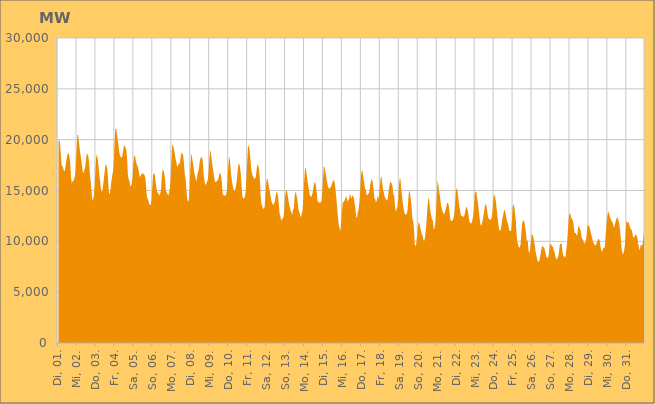
| Category | Series 0 |
|---|---|
|  Di, 01.  | 19693.642 |
|  Di, 01.  | 20068.897 |
|  Di, 01.  | 19688.691 |
|  Di, 01.  | 18616.505 |
|  Di, 01.  | 17537.358 |
|  Di, 01.  | 17402.935 |
|  Di, 01.  | 17214.777 |
|  Di, 01.  | 16918.035 |
|  Di, 01.  | 16916.652 |
|  Di, 01.  | 17365.938 |
|  Di, 01.  | 17901.29 |
|  Di, 01.  | 18314.461 |
|  Di, 01.  | 18692.964 |
|  Di, 01.  | 18643.132 |
|  Di, 01.  | 18341.745 |
|  Di, 01.  | 17614.667 |
|  Di, 01.  | 16274.69 |
|  Mi, 02.  | 15692.052 |
|  Mi, 02.  | 15936.958 |
|  Mi, 02.  | 15939.742 |
|  Mi, 02.  | 16109.594 |
|  Mi, 02.  | 16467.934 |
|  Mi, 02.  | 17242.414 |
|  Mi, 02.  | 19081.249 |
|  Mi, 02.  | 20461.468 |
|  Mi, 02.  | 20462.138 |
|  Mi, 02.  | 19762.932 |
|  Mi, 02.  | 19057.894 |
|  Mi, 02.  | 18480.672 |
|  Mi, 02.  | 17950.802 |
|  Mi, 02.  | 17387.023 |
|  Mi, 02.  | 16773.458 |
|  Mi, 02.  | 16740.052 |
|  Mi, 02.  | 17064.838 |
|  Mi, 02.  | 17352.052 |
|  Mi, 02.  | 18049.322 |
|  Mi, 02.  | 18628.759 |
|  Mi, 02.  | 18552.995 |
|  Mi, 02.  | 18334.909 |
|  Mi, 02.  | 17581.178 |
|  Mi, 02.  | 16430.205 |
|  Do, 03.  | 15855.174 |
|  Do, 03.  | 14891.868 |
|  Do, 03.  | 14044.178 |
|  Do, 03.  | 14127.762 |
|  Do, 03.  | 14552.361 |
|  Do, 03.  | 15573.614 |
|  Do, 03.  | 17344.207 |
|  Do, 03.  | 18490.431 |
|  Do, 03.  | 18384.52 |
|  Do, 03.  | 17949.707 |
|  Do, 03.  | 17244.817 |
|  Do, 03.  | 16397.238 |
|  Do, 03.  | 15811.812 |
|  Do, 03.  | 15038.098 |
|  Do, 03.  | 14839.016 |
|  Do, 03.  | 15147.596 |
|  Do, 03.  | 15774.472 |
|  Do, 03.  | 16466.453 |
|  Do, 03.  | 17140.58 |
|  Do, 03.  | 17571.423 |
|  Do, 03.  | 17480.672 |
|  Do, 03.  | 17066.1 |
|  Do, 03.  | 15951.009 |
|  Do, 03.  | 14719.392 |
|  Fr, 04.  | 14665.744 |
|  Fr, 04.  | 15145.658 |
|  Fr, 04.  | 15874.726 |
|  Fr, 04.  | 16383.368 |
|  Fr, 04.  | 16849.576 |
|  Fr, 04.  | 17575.166 |
|  Fr, 04.  | 19509.325 |
|  Fr, 04.  | 21045.221 |
|  Fr, 04.  | 21097.062 |
|  Fr, 04.  | 20607.852 |
|  Fr, 04.  | 20081.193 |
|  Fr, 04.  | 19480.207 |
|  Fr, 04.  | 18805.662 |
|  Fr, 04.  | 18411.908 |
|  Fr, 04.  | 18292.72 |
|  Fr, 04.  | 18207.278 |
|  Fr, 04.  | 18426.27 |
|  Fr, 04.  | 18925.554 |
|  Fr, 04.  | 19425.358 |
|  Fr, 04.  | 19377.806 |
|  Fr, 04.  | 19150.7 |
|  Fr, 04.  | 19034.544 |
|  Fr, 04.  | 18045.578 |
|  Fr, 04.  | 16480.56 |
|  Sa, 05.  | 16107.502 |
|  Sa, 05.  | 15874.636 |
|  Sa, 05.  | 15432.455 |
|  Sa, 05.  | 15449.189 |
|  Sa, 05.  | 15730.779 |
|  Sa, 05.  | 16362.493 |
|  Sa, 05.  | 17734.382 |
|  Sa, 05.  | 18499.935 |
|  Sa, 05.  | 18363.549 |
|  Sa, 05.  | 17937.359 |
|  Sa, 05.  | 17594.421 |
|  Sa, 05.  | 17469.32 |
|  Sa, 05.  | 17171.495 |
|  Sa, 05.  | 16739.804 |
|  Sa, 05.  | 16323.036 |
|  Sa, 05.  | 16424.166 |
|  Sa, 05.  | 16590.156 |
|  Sa, 05.  | 16717.886 |
|  Sa, 05.  | 16570.696 |
|  Sa, 05.  | 16689.81 |
|  Sa, 05.  | 16519.621 |
|  Sa, 05.  | 16222.665 |
|  Sa, 05.  | 15489.944 |
|  Sa, 05.  | 14380.56 |
|  So, 06.  | 14174.498 |
|  So, 06.  | 13963.707 |
|  So, 06.  | 13685.215 |
|  So, 06.  | 13602.306 |
|  So, 06.  | 13578.073 |
|  So, 06.  | 14164.936 |
|  So, 06.  | 15494.169 |
|  So, 06.  | 16555.933 |
|  So, 06.  | 16734.002 |
|  So, 06.  | 16622.776 |
|  So, 06.  | 15908.81 |
|  So, 06.  | 15309.197 |
|  So, 06.  | 14864.817 |
|  So, 06.  | 14751.718 |
|  So, 06.  | 14652.493 |
|  So, 06.  | 14509.425 |
|  So, 06.  | 14740.953 |
|  So, 06.  | 15137.05 |
|  So, 06.  | 16447.303 |
|  So, 06.  | 17139.758 |
|  So, 06.  | 16938.596 |
|  So, 06.  | 16689.829 |
|  So, 06.  | 16071.81 |
|  So, 06.  | 14958.146 |
|  Mo, 07.  | 14843.218 |
|  Mo, 07.  | 14677.03 |
|  Mo, 07.  | 14498.136 |
|  Mo, 07.  | 14744.186 |
|  Mo, 07.  | 15177.472 |
|  Mo, 07.  | 16001.507 |
|  Mo, 07.  | 17843.126 |
|  Mo, 07.  | 19536.629 |
|  Mo, 07.  | 19415.579 |
|  Mo, 07.  | 19113.39 |
|  Mo, 07.  | 18734.884 |
|  Mo, 07.  | 18241.646 |
|  Mo, 07.  | 17875.373 |
|  Mo, 07.  | 17510.144 |
|  Mo, 07.  | 17288.171 |
|  Mo, 07.  | 17658.031 |
|  Mo, 07.  | 17577.209 |
|  Mo, 07.  | 17811.568 |
|  Mo, 07.  | 18399.456 |
|  Mo, 07.  | 18749.404 |
|  Mo, 07.  | 18634.524 |
|  Mo, 07.  | 18430.051 |
|  Mo, 07.  | 17612.606 |
|  Mo, 07.  | 16554.201 |
|  Di, 08.  | 16167.428 |
|  Di, 08.  | 15096.06 |
|  Di, 08.  | 14233.565 |
|  Di, 08.  | 13948.062 |
|  Di, 08.  | 13933.579 |
|  Di, 08.  | 14978.086 |
|  Di, 08.  | 17112.792 |
|  Di, 08.  | 18555.711 |
|  Di, 08.  | 18394.727 |
|  Di, 08.  | 17800.674 |
|  Di, 08.  | 17340.145 |
|  Di, 08.  | 16731.418 |
|  Di, 08.  | 16432.752 |
|  Di, 08.  | 16118.751 |
|  Di, 08.  | 15938.183 |
|  Di, 08.  | 16610.821 |
|  Di, 08.  | 16847.005 |
|  Di, 08.  | 17246.686 |
|  Di, 08.  | 17898.538 |
|  Di, 08.  | 18214.894 |
|  Di, 08.  | 18249.159 |
|  Di, 08.  | 18258.116 |
|  Di, 08.  | 17632.417 |
|  Di, 08.  | 16456.925 |
|  Mi, 09.  | 15890.884 |
|  Mi, 09.  | 15538.059 |
|  Mi, 09.  | 15604.455 |
|  Mi, 09.  | 15848.106 |
|  Mi, 09.  | 16033.885 |
|  Mi, 09.  | 16723.831 |
|  Mi, 09.  | 17931.044 |
|  Mi, 09.  | 18966.731 |
|  Mi, 09.  | 18722.198 |
|  Mi, 09.  | 18071.224 |
|  Mi, 09.  | 17452.52 |
|  Mi, 09.  | 16954.838 |
|  Mi, 09.  | 16366.605 |
|  Mi, 09.  | 15937.718 |
|  Mi, 09.  | 15826.616 |
|  Mi, 09.  | 15862.853 |
|  Mi, 09.  | 15986.187 |
|  Mi, 09.  | 16029.794 |
|  Mi, 09.  | 16336.956 |
|  Mi, 09.  | 16695.312 |
|  Mi, 09.  | 16699.865 |
|  Mi, 09.  | 16408.897 |
|  Mi, 09.  | 15714.563 |
|  Mi, 09.  | 14617.999 |
|  Do, 10.  | 14551.582 |
|  Do, 10.  | 14473.575 |
|  Do, 10.  | 14528.21 |
|  Do, 10.  | 14512.459 |
|  Do, 10.  | 14873.211 |
|  Do, 10.  | 15948.056 |
|  Do, 10.  | 17349.116 |
|  Do, 10.  | 18426.539 |
|  Do, 10.  | 17995.885 |
|  Do, 10.  | 17139.297 |
|  Do, 10.  | 16301.995 |
|  Do, 10.  | 15725.068 |
|  Do, 10.  | 15324.376 |
|  Do, 10.  | 15037.393 |
|  Do, 10.  | 14925.538 |
|  Do, 10.  | 15157.491 |
|  Do, 10.  | 15551.175 |
|  Do, 10.  | 16120.004 |
|  Do, 10.  | 17070.609 |
|  Do, 10.  | 17630.181 |
|  Do, 10.  | 17585.21 |
|  Do, 10.  | 17235.866 |
|  Do, 10.  | 16504.407 |
|  Do, 10.  | 15216.935 |
|  Fr, 11.  | 14401.631 |
|  Fr, 11.  | 14218.524 |
|  Fr, 11.  | 14236.934 |
|  Fr, 11.  | 14351.26 |
|  Fr, 11.  | 14853.424 |
|  Fr, 11.  | 16172.934 |
|  Fr, 11.  | 17835.706 |
|  Fr, 11.  | 19386.711 |
|  Fr, 11.  | 19357.71 |
|  Fr, 11.  | 19027.297 |
|  Fr, 11.  | 18095.358 |
|  Fr, 11.  | 17132.397 |
|  Fr, 11.  | 16697.203 |
|  Fr, 11.  | 16438.041 |
|  Fr, 11.  | 16302.572 |
|  Fr, 11.  | 16131.998 |
|  Fr, 11.  | 16205.603 |
|  Fr, 11.  | 16350.64 |
|  Fr, 11.  | 17095.817 |
|  Fr, 11.  | 17600.057 |
|  Fr, 11.  | 17423.741 |
|  Fr, 11.  | 17096.615 |
|  Fr, 11.  | 16082.373 |
|  Fr, 11.  | 14476.13 |
|  Sa, 12.  | 13613.989 |
|  Sa, 12.  | 13531.665 |
|  Sa, 12.  | 13123.821 |
|  Sa, 12.  | 13297.325 |
|  Sa, 12.  | 13337.603 |
|  Sa, 12.  | 14350.381 |
|  Sa, 12.  | 15611.52 |
|  Sa, 12.  | 16152.32 |
|  Sa, 12.  | 16128.659 |
|  Sa, 12.  | 15549.527 |
|  Sa, 12.  | 15142.291 |
|  Sa, 12.  | 14688.334 |
|  Sa, 12.  | 14254.994 |
|  Sa, 12.  | 13863.821 |
|  Sa, 12.  | 13634.153 |
|  Sa, 12.  | 13619.812 |
|  Sa, 12.  | 13698.325 |
|  Sa, 12.  | 13953.349 |
|  Sa, 12.  | 14422.447 |
|  Sa, 12.  | 14852.406 |
|  Sa, 12.  | 14803.261 |
|  Sa, 12.  | 14435.492 |
|  Sa, 12.  | 13681.515 |
|  Sa, 12.  | 12708.65 |
|  So, 13.  | 12475.534 |
|  So, 13.  | 11972.435 |
|  So, 13.  | 12274.796 |
|  So, 13.  | 12181.289 |
|  So, 13.  | 12408.808 |
|  So, 13.  | 13162.425 |
|  So, 13.  | 14439.965 |
|  So, 13.  | 14928.736 |
|  So, 13.  | 15072.53 |
|  So, 13.  | 14665.829 |
|  So, 13.  | 14167.014 |
|  So, 13.  | 13649.558 |
|  So, 13.  | 13354.012 |
|  So, 13.  | 13009.182 |
|  So, 13.  | 12882.278 |
|  So, 13.  | 12530.605 |
|  So, 13.  | 13164.16 |
|  So, 13.  | 13176.024 |
|  So, 13.  | 14365.354 |
|  So, 13.  | 14907.756 |
|  So, 13.  | 14701.555 |
|  So, 13.  | 14302.239 |
|  So, 13.  | 13745.249 |
|  So, 13.  | 13058.803 |
|  Mo, 14.  | 12884.322 |
|  Mo, 14.  | 12583.888 |
|  Mo, 14.  | 12356.828 |
|  Mo, 14.  | 12676.067 |
|  Mo, 14.  | 13042.885 |
|  Mo, 14.  | 14070.265 |
|  Mo, 14.  | 15788.222 |
|  Mo, 14.  | 16997.733 |
|  Mo, 14.  | 17321.184 |
|  Mo, 14.  | 16703.037 |
|  Mo, 14.  | 16116.706 |
|  Mo, 14.  | 15511.979 |
|  Mo, 14.  | 15142.293 |
|  Mo, 14.  | 14631.879 |
|  Mo, 14.  | 14420.275 |
|  Mo, 14.  | 14366.652 |
|  Mo, 14.  | 14543.022 |
|  Mo, 14.  | 14855.428 |
|  Mo, 14.  | 15436.196 |
|  Mo, 14.  | 15810.234 |
|  Mo, 14.  | 15774.187 |
|  Mo, 14.  | 15453.711 |
|  Mo, 14.  | 14844.051 |
|  Mo, 14.  | 13947.215 |
|  Di, 15.  | 13870.828 |
|  Di, 15.  | 13850.669 |
|  Di, 15.  | 13760.594 |
|  Di, 15.  | 13846.486 |
|  Di, 15.  | 13957.984 |
|  Di, 15.  | 14977.208 |
|  Di, 15.  | 16239.246 |
|  Di, 15.  | 17345.582 |
|  Di, 15.  | 17292.376 |
|  Di, 15.  | 16815.653 |
|  Di, 15.  | 16361.659 |
|  Di, 15.  | 15859.495 |
|  Di, 15.  | 15470.42 |
|  Di, 15.  | 15255.098 |
|  Di, 15.  | 15160.376 |
|  Di, 15.  | 15287.477 |
|  Di, 15.  | 15335.172 |
|  Di, 15.  | 15571.278 |
|  Di, 15.  | 15831.527 |
|  Di, 15.  | 16004.602 |
|  Di, 15.  | 15971.314 |
|  Di, 15.  | 15607.685 |
|  Di, 15.  | 14921.26 |
|  Di, 15.  | 14075.209 |
|  Mi, 16.  | 13227.365 |
|  Mi, 16.  | 12281.258 |
|  Mi, 16.  | 11556.515 |
|  Mi, 16.  | 11279.527 |
|  Mi, 16.  | 11012.737 |
|  Mi, 16.  | 11896.013 |
|  Mi, 16.  | 13117.529 |
|  Mi, 16.  | 13835.236 |
|  Mi, 16.  | 13864.945 |
|  Mi, 16.  | 13978.18 |
|  Mi, 16.  | 14165.731 |
|  Mi, 16.  | 14463.844 |
|  Mi, 16.  | 14295.494 |
|  Mi, 16.  | 13887.259 |
|  Mi, 16.  | 14087.165 |
|  Mi, 16.  | 14154.596 |
|  Mi, 16.  | 14651.084 |
|  Mi, 16.  | 14497.529 |
|  Mi, 16.  | 14193.971 |
|  Mi, 16.  | 14513.953 |
|  Mi, 16.  | 14458.729 |
|  Mi, 16.  | 14222.898 |
|  Mi, 16.  | 13684.48 |
|  Mi, 16.  | 13240.919 |
|  Do, 17.  | 12351.467 |
|  Do, 17.  | 12359.338 |
|  Do, 17.  | 12821.416 |
|  Do, 17.  | 13196.273 |
|  Do, 17.  | 13797.756 |
|  Do, 17.  | 14885.098 |
|  Do, 17.  | 16405.323 |
|  Do, 17.  | 16978.972 |
|  Do, 17.  | 16941.269 |
|  Do, 17.  | 16265.911 |
|  Do, 17.  | 15825.856 |
|  Do, 17.  | 15261.086 |
|  Do, 17.  | 15058.958 |
|  Do, 17.  | 14580.67 |
|  Do, 17.  | 14510.793 |
|  Do, 17.  | 14660.915 |
|  Do, 17.  | 14729.494 |
|  Do, 17.  | 15076.052 |
|  Do, 17.  | 15643.659 |
|  Do, 17.  | 16073.573 |
|  Do, 17.  | 16090.473 |
|  Do, 17.  | 15758.109 |
|  Do, 17.  | 14983.02 |
|  Do, 17.  | 14238.48 |
|  Fr, 18.  | 14139.535 |
|  Fr, 18.  | 13794.059 |
|  Fr, 18.  | 14028.002 |
|  Fr, 18.  | 14526.89 |
|  Fr, 18.  | 14137.639 |
|  Fr, 18.  | 14543.03 |
|  Fr, 18.  | 15482.342 |
|  Fr, 18.  | 16271.977 |
|  Fr, 18.  | 16436.735 |
|  Fr, 18.  | 15601.624 |
|  Fr, 18.  | 15080.844 |
|  Fr, 18.  | 14749.528 |
|  Fr, 18.  | 14391.763 |
|  Fr, 18.  | 14257.592 |
|  Fr, 18.  | 14077.536 |
|  Fr, 18.  | 13981.361 |
|  Fr, 18.  | 14284.762 |
|  Fr, 18.  | 14946.938 |
|  Fr, 18.  | 15492.944 |
|  Fr, 18.  | 15874.767 |
|  Fr, 18.  | 15805.748 |
|  Fr, 18.  | 15646.076 |
|  Fr, 18.  | 15369.621 |
|  Fr, 18.  | 14616.03 |
|  Sa, 19.  | 14471.56 |
|  Sa, 19.  | 13530.029 |
|  Sa, 19.  | 12874.006 |
|  Sa, 19.  | 13158.321 |
|  Sa, 19.  | 13343.709 |
|  Sa, 19.  | 14112.805 |
|  Sa, 19.  | 15439.131 |
|  Sa, 19.  | 16201.545 |
|  Sa, 19.  | 16126.529 |
|  Sa, 19.  | 15123.885 |
|  Sa, 19.  | 14420.338 |
|  Sa, 19.  | 13757.993 |
|  Sa, 19.  | 13183.072 |
|  Sa, 19.  | 12806.464 |
|  Sa, 19.  | 12659.415 |
|  Sa, 19.  | 12617.703 |
|  Sa, 19.  | 12695.474 |
|  Sa, 19.  | 13081.017 |
|  Sa, 19.  | 14258.676 |
|  Sa, 19.  | 15035.547 |
|  Sa, 19.  | 14735.011 |
|  Sa, 19.  | 14208.449 |
|  Sa, 19.  | 13403.896 |
|  Sa, 19.  | 12259.784 |
|  So, 20.  | 11997.542 |
|  So, 20.  | 11272.293 |
|  So, 20.  | 9801.638 |
|  So, 20.  | 9460.418 |
|  So, 20.  | 9744.384 |
|  So, 20.  | 10506.245 |
|  So, 20.  | 11441.558 |
|  So, 20.  | 11914.345 |
|  So, 20.  | 11715.632 |
|  So, 20.  | 11362.787 |
|  So, 20.  | 11010.028 |
|  So, 20.  | 10689.29 |
|  So, 20.  | 10549.998 |
|  So, 20.  | 10163.65 |
|  So, 20.  | 10014.743 |
|  So, 20.  | 10343.157 |
|  So, 20.  | 11101.999 |
|  So, 20.  | 11927.807 |
|  So, 20.  | 13205.933 |
|  So, 20.  | 14073.894 |
|  So, 20.  | 14332.341 |
|  So, 20.  | 13498.422 |
|  So, 20.  | 12884.708 |
|  So, 20.  | 12483.484 |
|  Mo, 21.  | 12109.736 |
|  Mo, 21.  | 12048.794 |
|  Mo, 21.  | 11195.347 |
|  Mo, 21.  | 11285.097 |
|  Mo, 21.  | 11651.723 |
|  Mo, 21.  | 12776.051 |
|  Mo, 21.  | 14633.733 |
|  Mo, 21.  | 15928.767 |
|  Mo, 21.  | 15595.537 |
|  Mo, 21.  | 14919.48 |
|  Mo, 21.  | 14374.891 |
|  Mo, 21.  | 13728.819 |
|  Mo, 21.  | 13265.662 |
|  Mo, 21.  | 12975.764 |
|  Mo, 21.  | 12817.621 |
|  Mo, 21.  | 12642.294 |
|  Mo, 21.  | 12799.092 |
|  Mo, 21.  | 13113.773 |
|  Mo, 21.  | 13422.099 |
|  Mo, 21.  | 13780.557 |
|  Mo, 21.  | 13780.849 |
|  Mo, 21.  | 13580.414 |
|  Mo, 21.  | 12951.079 |
|  Mo, 21.  | 12181.769 |
|  Di, 22.  | 12018.79 |
|  Di, 22.  | 12000.318 |
|  Di, 22.  | 12076.787 |
|  Di, 22.  | 12277.479 |
|  Di, 22.  | 12630.038 |
|  Di, 22.  | 13494.916 |
|  Di, 22.  | 14710.506 |
|  Di, 22.  | 15283.387 |
|  Di, 22.  | 15022.259 |
|  Di, 22.  | 14413.276 |
|  Di, 22.  | 13744.63 |
|  Di, 22.  | 13193.079 |
|  Di, 22.  | 12765.783 |
|  Di, 22.  | 12453.147 |
|  Di, 22.  | 12529.831 |
|  Di, 22.  | 12434.286 |
|  Di, 22.  | 12387.656 |
|  Di, 22.  | 12582.253 |
|  Di, 22.  | 12909.125 |
|  Di, 22.  | 13339.211 |
|  Di, 22.  | 13360.941 |
|  Di, 22.  | 13107.379 |
|  Di, 22.  | 12670.753 |
|  Di, 22.  | 11975.555 |
|  Mi, 23.  | 11836.061 |
|  Mi, 23.  | 11756.379 |
|  Mi, 23.  | 11786.106 |
|  Mi, 23.  | 12061.165 |
|  Mi, 23.  | 12479.053 |
|  Mi, 23.  | 13266.395 |
|  Mi, 23.  | 14648.412 |
|  Mi, 23.  | 14914.282 |
|  Mi, 23.  | 14879.995 |
|  Mi, 23.  | 14294.87 |
|  Mi, 23.  | 13795.083 |
|  Mi, 23.  | 13113.977 |
|  Mi, 23.  | 12399.627 |
|  Mi, 23.  | 11713.309 |
|  Mi, 23.  | 11528.397 |
|  Mi, 23.  | 11713.795 |
|  Mi, 23.  | 12022.064 |
|  Mi, 23.  | 12471.389 |
|  Mi, 23.  | 12979.667 |
|  Mi, 23.  | 13538.346 |
|  Mi, 23.  | 13670.419 |
|  Mi, 23.  | 13436.693 |
|  Mi, 23.  | 12823.91 |
|  Mi, 23.  | 12330.723 |
|  Do, 24.  | 12222.285 |
|  Do, 24.  | 12104.147 |
|  Do, 24.  | 12140.728 |
|  Do, 24.  | 12215.083 |
|  Do, 24.  | 12581.786 |
|  Do, 24.  | 13452.916 |
|  Do, 24.  | 14427.267 |
|  Do, 24.  | 14624.078 |
|  Do, 24.  | 14256.266 |
|  Do, 24.  | 13790.532 |
|  Do, 24.  | 13008.54 |
|  Do, 24.  | 12302.062 |
|  Do, 24.  | 11618.622 |
|  Do, 24.  | 11135.111 |
|  Do, 24.  | 11043.189 |
|  Do, 24.  | 11121.66 |
|  Do, 24.  | 11666.423 |
|  Do, 24.  | 12234.448 |
|  Do, 24.  | 12569.905 |
|  Do, 24.  | 13042.587 |
|  Do, 24.  | 13080.485 |
|  Do, 24.  | 12788.828 |
|  Do, 24.  | 12282.188 |
|  Do, 24.  | 11904.213 |
|  Fr, 25.  | 11767.486 |
|  Fr, 25.  | 11335.952 |
|  Fr, 25.  | 11029.191 |
|  Fr, 25.  | 11040.067 |
|  Fr, 25.  | 10995.662 |
|  Fr, 25.  | 11946.608 |
|  Fr, 25.  | 13380.676 |
|  Fr, 25.  | 13658.477 |
|  Fr, 25.  | 13404.464 |
|  Fr, 25.  | 12731.876 |
|  Fr, 25.  | 11995.532 |
|  Fr, 25.  | 10669.449 |
|  Fr, 25.  | 9915.687 |
|  Fr, 25.  | 9599.664 |
|  Fr, 25.  | 9406.671 |
|  Fr, 25.  | 9399.385 |
|  Fr, 25.  | 9690.876 |
|  Fr, 25.  | 10887.891 |
|  Fr, 25.  | 11732.055 |
|  Fr, 25.  | 12063.311 |
|  Fr, 25.  | 12043.823 |
|  Fr, 25.  | 11847.813 |
|  Fr, 25.  | 11313.029 |
|  Fr, 25.  | 10683.348 |
|  Sa, 26.  | 9964.823 |
|  Sa, 26.  | 10134.093 |
|  Sa, 26.  | 9123.318 |
|  Sa, 26.  | 8797.891 |
|  Sa, 26.  | 9110.686 |
|  Sa, 26.  | 9848.583 |
|  Sa, 26.  | 10621.753 |
|  Sa, 26.  | 10699.407 |
|  Sa, 26.  | 10448.728 |
|  Sa, 26.  | 9984.182 |
|  Sa, 26.  | 9608.051 |
|  Sa, 26.  | 8974.846 |
|  Sa, 26.  | 8620.349 |
|  Sa, 26.  | 8267.645 |
|  Sa, 26.  | 8001.475 |
|  Sa, 26.  | 7979.376 |
|  Sa, 26.  | 8153.268 |
|  Sa, 26.  | 8601.948 |
|  Sa, 26.  | 9092.25 |
|  Sa, 26.  | 9418.402 |
|  Sa, 26.  | 9576.912 |
|  Sa, 26.  | 9418.456 |
|  Sa, 26.  | 9371.617 |
|  Sa, 26.  | 9060.216 |
|  So, 27.  | 8714.623 |
|  So, 27.  | 8378.936 |
|  So, 27.  | 8386.499 |
|  So, 27.  | 8423.483 |
|  So, 27.  | 8925.134 |
|  So, 27.  | 9624.054 |
|  So, 27.  | 9758.996 |
|  So, 27.  | 9663.654 |
|  So, 27.  | 9429.333 |
|  So, 27.  | 9522.812 |
|  So, 27.  | 9074.411 |
|  So, 27.  | 8940.699 |
|  So, 27.  | 8524.701 |
|  So, 27.  | 8273.596 |
|  So, 27.  | 8257.815 |
|  So, 27.  | 8372.078 |
|  So, 27.  | 8619.02 |
|  So, 27.  | 9208.726 |
|  So, 27.  | 9802.796 |
|  So, 27.  | 9712.249 |
|  So, 27.  | 9852.174 |
|  So, 27.  | 9015.022 |
|  So, 27.  | 8595.54 |
|  Mo, 28.  | 8512.964 |
|  Mo, 28.  | 8384.658 |
|  Mo, 28.  | 8558.914 |
|  Mo, 28.  | 9271.418 |
|  Mo, 28.  | 9927.54 |
|  Mo, 28.  | 11190.359 |
|  Mo, 28.  | 12302.356 |
|  Mo, 28.  | 12776.375 |
|  Mo, 28.  | 12678.316 |
|  Mo, 28.  | 12354.338 |
|  Mo, 28.  | 12192.428 |
|  Mo, 28.  | 12077.076 |
|  Mo, 28.  | 11737.907 |
|  Mo, 28.  | 10919.599 |
|  Mo, 28.  | 10787.086 |
|  Mo, 28.  | 10816.283 |
|  Mo, 28.  | 10541.793 |
|  Mo, 28.  | 10721.745 |
|  Mo, 28.  | 11488.781 |
|  Mo, 28.  | 11421.608 |
|  Mo, 28.  | 11250.837 |
|  Mo, 28.  | 11044.238 |
|  Mo, 28.  | 10504.408 |
|  Mo, 28.  | 10192.464 |
|  Di, 29.  | 10195.526 |
|  Di, 29.  | 9870.036 |
|  Di, 29.  | 9804.02 |
|  Di, 29.  | 9871.018 |
|  Di, 29.  | 10230.102 |
|  Di, 29.  | 10951.426 |
|  Di, 29.  | 11567.358 |
|  Di, 29.  | 11568.445 |
|  Di, 29.  | 11473.499 |
|  Di, 29.  | 11167.698 |
|  Di, 29.  | 10811.838 |
|  Di, 29.  | 10503.805 |
|  Di, 29.  | 10158.971 |
|  Di, 29.  | 9909.461 |
|  Di, 29.  | 9753.679 |
|  Di, 29.  | 9584.05 |
|  Di, 29.  | 9624.214 |
|  Di, 29.  | 9759.308 |
|  Di, 29.  | 9969.034 |
|  Di, 29.  | 10179.229 |
|  Di, 29.  | 10242.547 |
|  Di, 29.  | 10090.716 |
|  Di, 29.  | 9552.996 |
|  Di, 29.  | 9163.845 |
|  Mi, 30.  | 8948.992 |
|  Mi, 30.  | 9197.77 |
|  Mi, 30.  | 9351.349 |
|  Mi, 30.  | 9300.054 |
|  Mi, 30.  | 9747.118 |
|  Mi, 30.  | 10954.253 |
|  Mi, 30.  | 11907.26 |
|  Mi, 30.  | 12575.366 |
|  Mi, 30.  | 12986.209 |
|  Mi, 30.  | 12703.686 |
|  Mi, 30.  | 12409.552 |
|  Mi, 30.  | 12244.626 |
|  Mi, 30.  | 11995.187 |
|  Mi, 30.  | 11898.301 |
|  Mi, 30.  | 11759.338 |
|  Mi, 30.  | 11357.348 |
|  Mi, 30.  | 11457.15 |
|  Mi, 30.  | 11852.767 |
|  Mi, 30.  | 12122.396 |
|  Mi, 30.  | 12338.028 |
|  Mi, 30.  | 12312.465 |
|  Mi, 30.  | 12030.008 |
|  Mi, 30.  | 11671.138 |
|  Mi, 30.  | 11050.136 |
|  Do, 31.  | 10165.63 |
|  Do, 31.  | 9236.945 |
|  Do, 31.  | 8819.668 |
|  Do, 31.  | 8773.324 |
|  Do, 31.  | 9045.126 |
|  Do, 31.  | 9610.722 |
|  Do, 31.  | 10760.134 |
|  Do, 31.  | 12022.604 |
|  Do, 31.  | 11839.828 |
|  Do, 31.  | 11876.036 |
|  Do, 31.  | 11887 |
|  Do, 31.  | 11508.68 |
|  Do, 31.  | 11259.762 |
|  Do, 31.  | 11171.549 |
|  Do, 31.  | 11080.595 |
|  Do, 31.  | 10550.971 |
|  Do, 31.  | 10331.862 |
|  Do, 31.  | 10418.19 |
|  Do, 31.  | 10588.971 |
|  Do, 31.  | 10671.69 |
|  Do, 31.  | 10570.978 |
|  Do, 31.  | 10278.296 |
|  Do, 31.  | 9700.278 |
|  Do, 31.  | 9320.123 |
|  Fr, 01.  | 9112.385 |
|  Fr, 01.  | 9656.062 |
|  Fr, 01.  | 9577.028 |
|  Fr, 01.  | 9600.932 |
|  Fr, 01.  | 9979.143 |
|  Fr, 01.  | 10644.398 |
|    | 12064.727 |